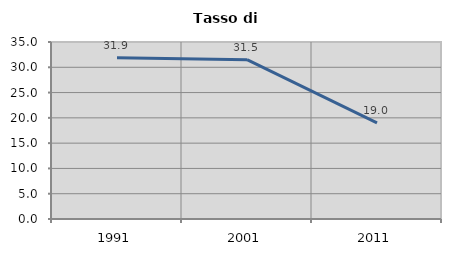
| Category | Tasso di disoccupazione   |
|---|---|
| 1991.0 | 31.874 |
| 2001.0 | 31.507 |
| 2011.0 | 19.003 |